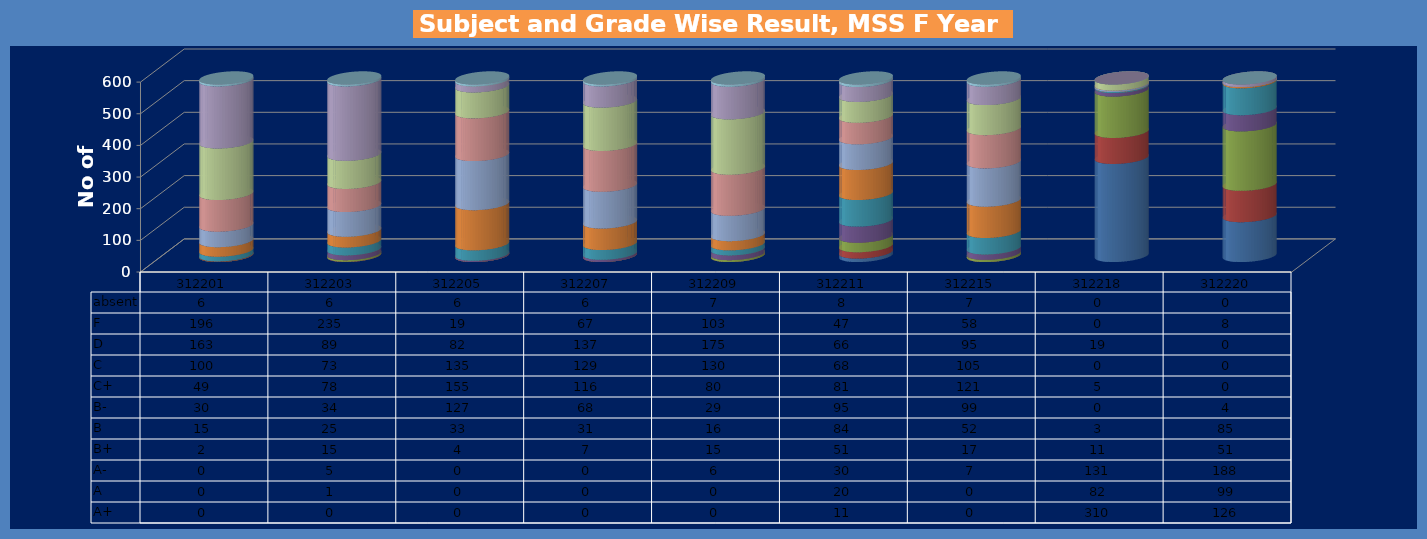
| Category | A+ | A | A- | B+ | B | B- | C+ | C | D | F | absent |
|---|---|---|---|---|---|---|---|---|---|---|---|
| 312201.0 | 0 | 0 | 0 | 2 | 15 | 30 | 49 | 100 | 163 | 196 | 6 |
| 312203.0 | 0 | 1 | 5 | 15 | 25 | 34 | 78 | 73 | 89 | 235 | 6 |
| 312205.0 | 0 | 0 | 0 | 4 | 33 | 127 | 155 | 135 | 82 | 19 | 6 |
| 312207.0 | 0 | 0 | 0 | 7 | 31 | 68 | 116 | 129 | 137 | 67 | 6 |
| 312209.0 | 0 | 0 | 6 | 15 | 16 | 29 | 80 | 130 | 175 | 103 | 7 |
| 312211.0 | 11 | 20 | 30 | 51 | 84 | 95 | 81 | 68 | 66 | 47 | 8 |
| 312215.0 | 0 | 0 | 7 | 17 | 52 | 99 | 121 | 105 | 95 | 58 | 7 |
| 312218.0 | 310 | 82 | 131 | 11 | 3 | 0 | 5 | 0 | 19 | 0 | 0 |
| 312220.0 | 126 | 99 | 188 | 51 | 85 | 4 | 0 | 0 | 0 | 8 | 0 |